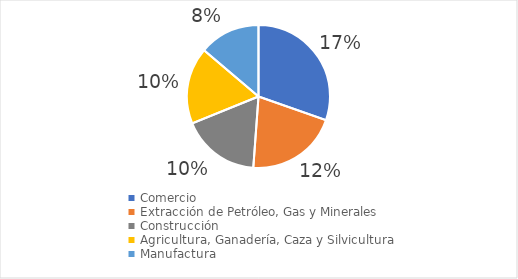
| Category | Series 0 |
|---|---|
| Comercio | 0.172 |
| Extracción de Petróleo, Gas y Minerales | 0.118 |
| Construcción | 0.1 |
| Agricultura, Ganadería, Caza y Silvicultura | 0.098 |
| Manufactura | 0.078 |